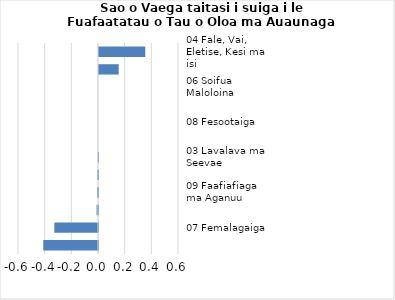
| Category |     Contributions |
|---|---|
| 04 Fale, Vai, Eletise, Kesi ma isi | 0.347 |
| 02 Ava Malosi ma Tapaa | 0.148 |
| 06 Soifua Maloloina | 0 |
| 10 Aoaoga | 0 |
| 08 Fesootaiga | 0 |
| 11 Faleaiga | 0 |
| 03 Lavalava ma Seevae | -0.001 |
| 12 Isi Oloa ma Auaunaga | -0.005 |
| 09 Faafiafiaga ma Aganuu | -0.007 |
| 05 Meafale, Mea Faigaluega mo Faaleleia o Aiga | -0.011 |
| 07 Femalagaiga | -0.327 |
| 01 Meaai ma Vaiinu | -0.41 |